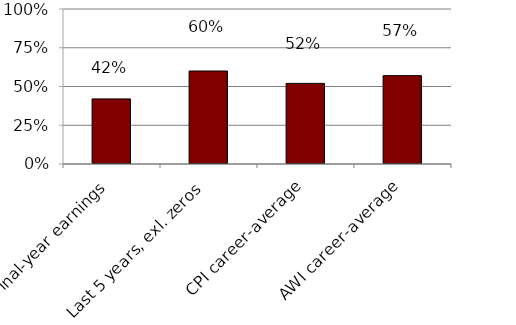
| Category | At risk |
|---|---|
| Final-year earnings | 0.42 |
| Last 5 years, exl. zeros | 0.6 |
| CPI career-average | 0.52 |
| AWI career-average | 0.57 |